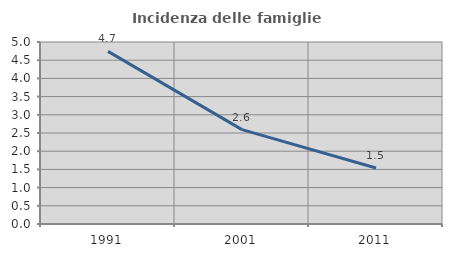
| Category | Incidenza delle famiglie numerose |
|---|---|
| 1991.0 | 4.744 |
| 2001.0 | 2.592 |
| 2011.0 | 1.537 |